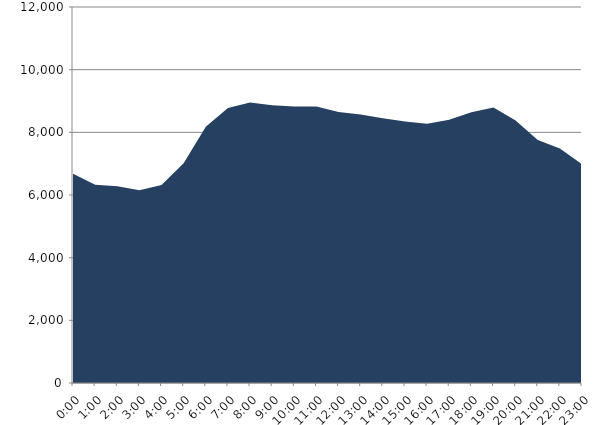
| Category | Series 0 | Series 1 |
|---|---|---|
| 2022-09-21 |  | 6679.21 |
| 2022-09-21 01:00:00 |  | 6329.892 |
| 2022-09-21 02:00:00 |  | 6282.057 |
| 2022-09-21 03:00:00 |  | 6153.836 |
| 2022-09-21 04:00:00 |  | 6321.432 |
| 2022-09-21 05:00:00 |  | 7015.09 |
| 2022-09-21 06:00:00 |  | 8179.501 |
| 2022-09-21 07:00:00 |  | 8779.221 |
| 2022-09-21 08:00:00 |  | 8952.691 |
| 2022-09-21 09:00:00 |  | 8862.541 |
| 2022-09-21 10:00:00 |  | 8820.539 |
| 2022-09-21 11:00:00 |  | 8827.842 |
| 2022-09-21 12:00:00 |  | 8648.092 |
| 2022-09-21 13:00:00 |  | 8568.955 |
| 2022-09-21 14:00:00 |  | 8448.509 |
| 2022-09-21 15:00:00 |  | 8345.635 |
| 2022-09-21 16:00:00 |  | 8273.628 |
| 2022-09-21 17:00:00 |  | 8401.531 |
| 2022-09-21 18:00:00 |  | 8638.666 |
| 2022-09-21 19:00:00 |  | 8795.571 |
| 2022-09-21 20:00:00 |  | 8379.347 |
| 2022-09-21 21:00:00 |  | 7752.548 |
| 2022-09-21 22:00:00 |  | 7483.536 |
| 2022-09-21 23:00:00 |  | 6982.781 |